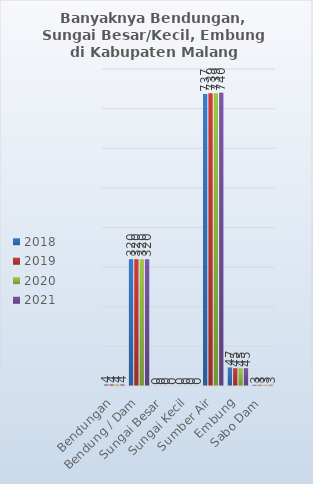
| Category | 2018 | 2019 | 2020 | 2021 |
|---|---|---|---|---|
| Bendungan | 4 | 4 | 4 | 4 |
| Bendung / Dam | 320 | 320 | 320 | 320 |
| Sungai Besar | 0 | 0 | 0 | 0 |
| Sungai Kecil | 0 | 0 | 0 | 0 |
| Sumber Air | 737 | 739 | 739 | 740 |
| Embung | 47 | 45 | 45 | 45 |
| Sabo Dam | 3 | 3 | 3 | 3 |